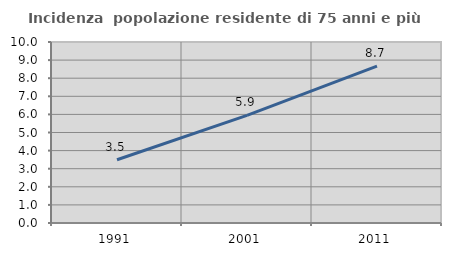
| Category | Incidenza  popolazione residente di 75 anni e più |
|---|---|
| 1991.0 | 3.493 |
| 2001.0 | 5.949 |
| 2011.0 | 8.672 |